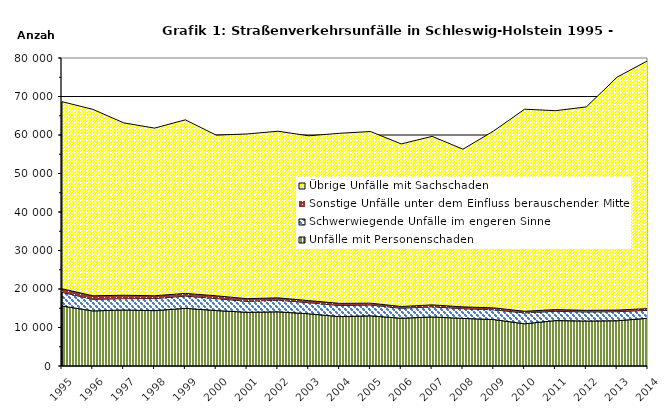
| Category | Unfälle mit Personenschaden | Schwerwiegende Unfälle im engeren Sinne | Sonstige Unfälle unter dem Einfluss berauschender Mittel 1) | Übrige Unfälle mit Sachschaden |
|---|---|---|---|---|
| 1995.0 | 15592 | 3544 | 920 | 48598 |
| 1996.0 | 14307 | 2996 | 937 | 48426 |
| 1997.0 | 14549 | 2947 | 883 | 44777 |
| 1998.0 | 14376 | 3136 | 737 | 43539 |
| 1999.0 | 14979 | 3185 | 696 | 45079 |
| 2000.0 | 14406 | 3105 | 725 | 41724 |
| 2001.0 | 13950 | 2845 | 688 | 42788 |
| 2002.0 | 14072 | 3028 | 595 | 43289 |
| 2003.0 | 13561 | 2866 | 559 | 42806 |
| 2004.0 | 12827 | 2877 | 564 | 44173 |
| 2005.0 | 13033 | 2795 | 499 | 44581 |
| 2006.0 | 12400 | 2588 | 466 | 42228 |
| 2007.0 | 12740 | 2628 | 507 | 43770 |
| 2008.0 | 12369 | 2510 | 481 | 40954 |
| 2009.0 | 12061 | 2528 | 502 | 45976 |
| 2010.0 | 10974 | 2803 | 441 | 52481 |
| 2011.0 | 11793 | 2419 | 443 | 51662 |
| 2012.0 | 11682 | 2353 | 422 | 52839 |
| 2013.0 | 11757 | 2357 | 414 | 60506 |
| 2014.0 | 12404 | 2056 | 448 | 64425 |